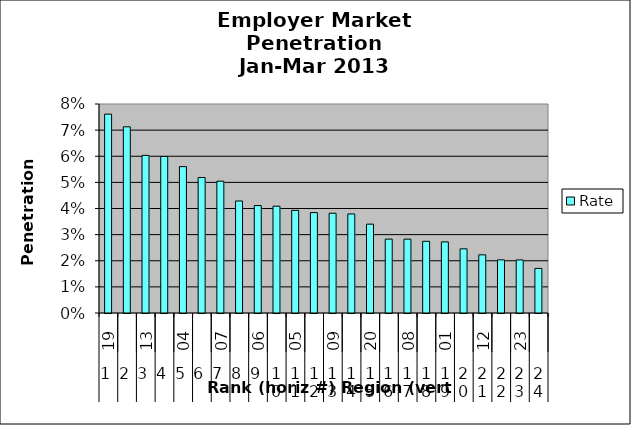
| Category | Rate |
|---|---|
| 0 | 0.076 |
| 1 | 0.071 |
| 2 | 0.06 |
| 3 | 0.06 |
| 4 | 0.056 |
| 5 | 0.052 |
| 6 | 0.05 |
| 7 | 0.043 |
| 8 | 0.041 |
| 9 | 0.041 |
| 10 | 0.039 |
| 11 | 0.038 |
| 12 | 0.038 |
| 13 | 0.038 |
| 14 | 0.034 |
| 15 | 0.028 |
| 16 | 0.028 |
| 17 | 0.027 |
| 18 | 0.027 |
| 19 | 0.025 |
| 20 | 0.022 |
| 21 | 0.02 |
| 22 | 0.02 |
| 23 | 0.017 |